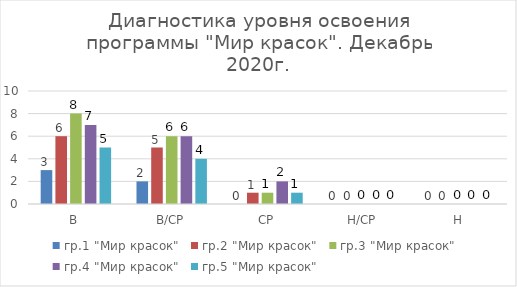
| Category | гр.1 "Мир красок" | гр.2 "Мир красок" | гр.3 "Мир красок" | гр.4 "Мир красок" | гр.5 "Мир красок"  |
|---|---|---|---|---|---|
| В | 3 | 6 | 8 | 7 | 5 |
| В/СР | 2 | 5 | 6 | 6 | 4 |
| СР | 0 | 1 | 1 | 2 | 1 |
| Н/СР | 0 | 0 | 0 | 0 | 0 |
| Н | 0 | 0 | 0 | 0 | 0 |